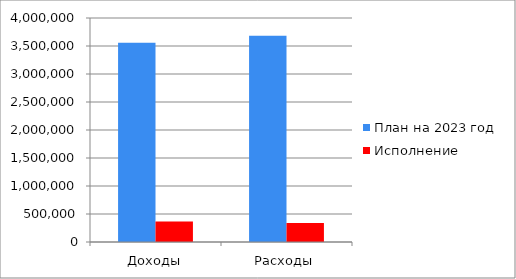
| Category | План на 2023 год | Исполнение |
|---|---|---|
| Доходы | 3558190.56 | 367609.62 |
| Расходы | 3683541 | 339783 |